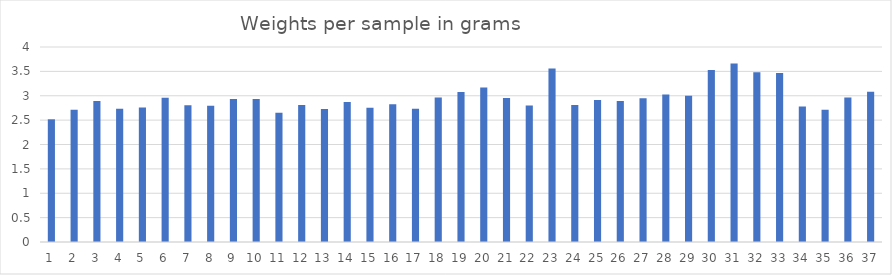
| Category | Series 0 |
|---|---|
| 0 | 2.517 |
| 1 | 2.715 |
| 2 | 2.89 |
| 3 | 2.734 |
| 4 | 2.761 |
| 5 | 2.958 |
| 6 | 2.803 |
| 7 | 2.794 |
| 8 | 2.935 |
| 9 | 2.935 |
| 10 | 2.651 |
| 11 | 2.811 |
| 12 | 2.726 |
| 13 | 2.873 |
| 14 | 2.752 |
| 15 | 2.827 |
| 16 | 2.732 |
| 17 | 2.964 |
| 18 | 3.078 |
| 19 | 3.168 |
| 20 | 2.955 |
| 21 | 2.801 |
| 22 | 3.56 |
| 23 | 2.808 |
| 24 | 2.913 |
| 25 | 2.893 |
| 26 | 2.947 |
| 27 | 3.028 |
| 28 | 3 |
| 29 | 3.528 |
| 30 | 3.663 |
| 31 | 3.483 |
| 32 | 3.469 |
| 33 | 2.778 |
| 34 | 2.715 |
| 35 | 2.962 |
| 36 | 3.081 |